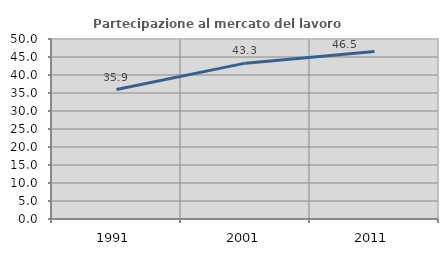
| Category | Partecipazione al mercato del lavoro  femminile |
|---|---|
| 1991.0 | 35.948 |
| 2001.0 | 43.295 |
| 2011.0 | 46.512 |